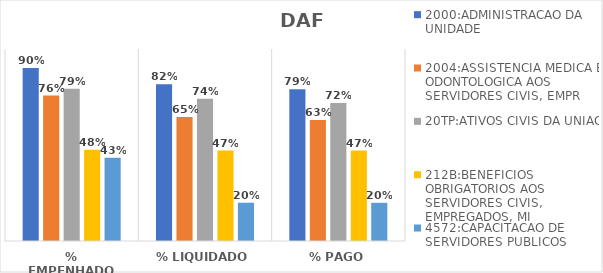
| Category | 2000:ADMINISTRACAO DA UNIDADE | 2004:ASSISTENCIA MEDICA E ODONTOLOGICA AOS SERVIDORES CIVIS, EMPR | 20TP:ATIVOS CIVIS DA UNIAO | 212B:BENEFICIOS OBRIGATORIOS AOS SERVIDORES CIVIS, EMPREGADOS, MI | 4572:CAPACITACAO DE SERVIDORES PUBLICOS FEDERAIS EM PROCESSO DE Q |
|---|---|---|---|---|---|
| % EMPENHADO | 0.901 | 0.757 | 0.793 | 0.476 | 0.434 |
| % LIQUIDADO | 0.817 | 0.646 | 0.741 | 0.471 | 0.199 |
| % PAGO | 0.79 | 0.631 | 0.719 | 0.471 | 0.199 |